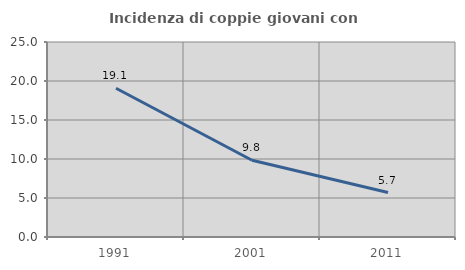
| Category | Incidenza di coppie giovani con figli |
|---|---|
| 1991.0 | 19.071 |
| 2001.0 | 9.834 |
| 2011.0 | 5.701 |